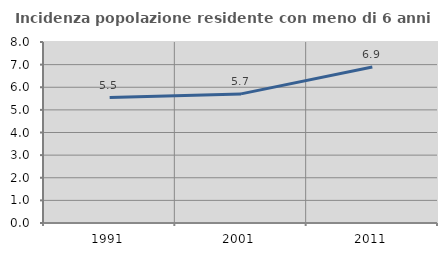
| Category | Incidenza popolazione residente con meno di 6 anni |
|---|---|
| 1991.0 | 5.546 |
| 2001.0 | 5.707 |
| 2011.0 | 6.897 |